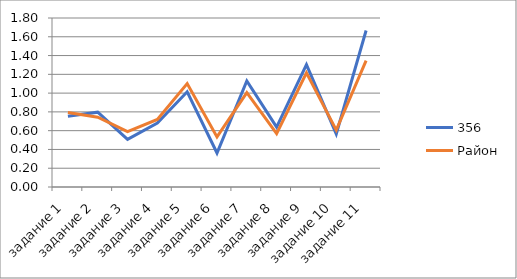
| Category | 356 | Район |
|---|---|---|
| задание 1 | 0.754 | 0.794 |
| задание 2 | 0.797 | 0.743 |
| задание 3 | 0.507 | 0.59 |
| задание 4 | 0.681 | 0.719 |
| задание 5 | 1.014 | 1.101 |
| задание 6 | 0.362 | 0.533 |
| задание 7 | 1.13 | 1.005 |
| задание 8 | 0.638 | 0.569 |
| задание 9 | 1.304 | 1.217 |
| задание 10 | 0.565 | 0.606 |
| задание 11 | 1.667 | 1.346 |